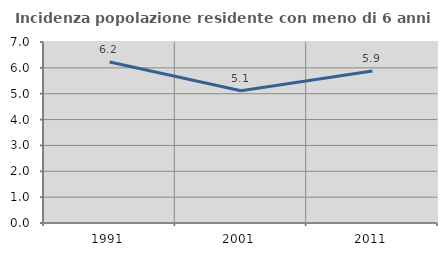
| Category | Incidenza popolazione residente con meno di 6 anni |
|---|---|
| 1991.0 | 6.224 |
| 2001.0 | 5.112 |
| 2011.0 | 5.88 |